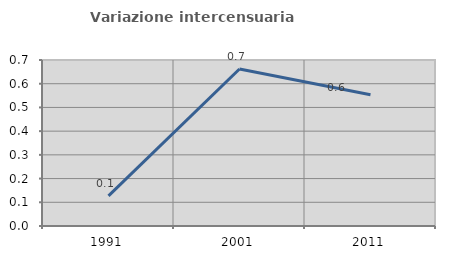
| Category | Variazione intercensuaria annua |
|---|---|
| 1991.0 | 0.127 |
| 2001.0 | 0.662 |
| 2011.0 | 0.554 |